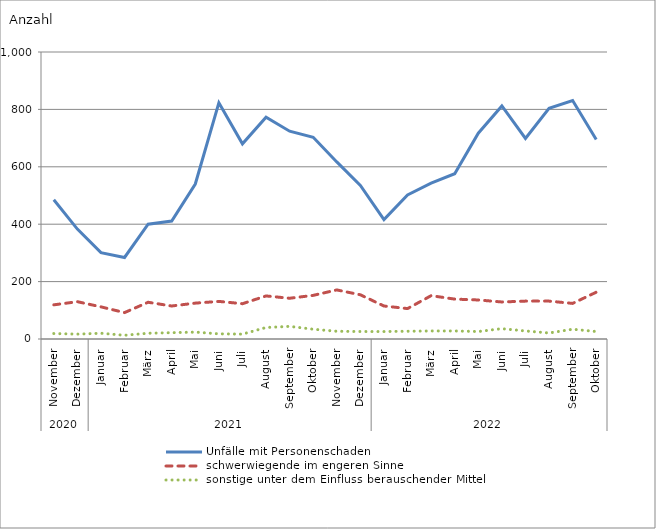
| Category | Unfälle mit Personenschaden | schwerwiegende im engeren Sinne | sonstige unter dem Einfluss berauschender Mittel |
|---|---|---|---|
| 0 | 485 | 119 | 19 |
| 1 | 383 | 130 | 17 |
| 2 | 301 | 112 | 20 |
| 3 | 284 | 92 | 13 |
| 4 | 400 | 128 | 20 |
| 5 | 411 | 115 | 22 |
| 6 | 540 | 125 | 24 |
| 7 | 823 | 131 | 18 |
| 8 | 680 | 123 | 17 |
| 9 | 773 | 150 | 40 |
| 10 | 724 | 142 | 44 |
| 11 | 703 | 152 | 34 |
| 12 | 617 | 171 | 27 |
| 13 | 535 | 154 | 26 |
| 14 | 416 | 115 | 26 |
| 15 | 502 | 106 | 27 |
| 16 | 543 | 151 | 28 |
| 17 | 576 | 139 | 28 |
| 18 | 717 | 136 | 26 |
| 19 | 812 | 129 | 36 |
| 20 | 699 | 132 | 28 |
| 21 | 804 | 132 | 21 |
| 22 | 831 | 124 | 34 |
| 23 | 695 | 163 | 26 |